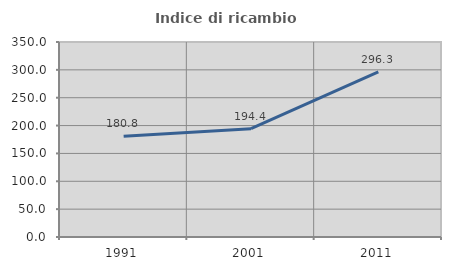
| Category | Indice di ricambio occupazionale  |
|---|---|
| 1991.0 | 180.769 |
| 2001.0 | 194.444 |
| 2011.0 | 296.296 |